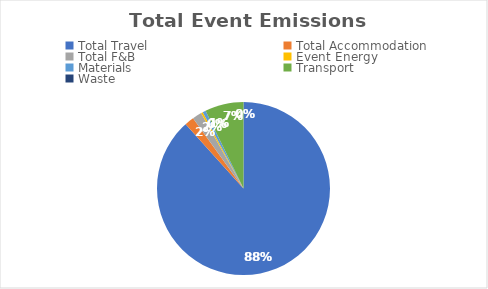
| Category | Series 0 |
|---|---|
| Total Travel | 7.58 |
| Total Accommodation | 0.15 |
| Total F&B | 0.15 |
| Event Energy | 0.03 |
| Materials | 0.05 |
| Transport | 0.62 |
| Waste | 0 |